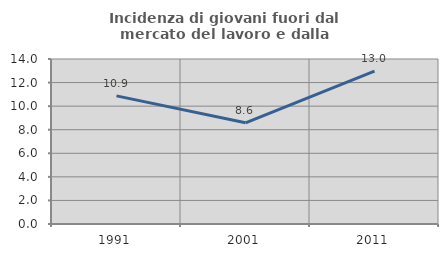
| Category | Incidenza di giovani fuori dal mercato del lavoro e dalla formazione  |
|---|---|
| 1991.0 | 10.87 |
| 2001.0 | 8.584 |
| 2011.0 | 12.963 |